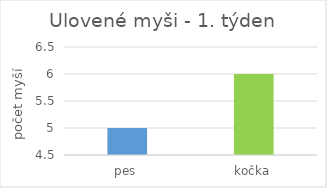
| Category | ulovené myši |
|---|---|
| pes | 5 |
| kočka | 6 |